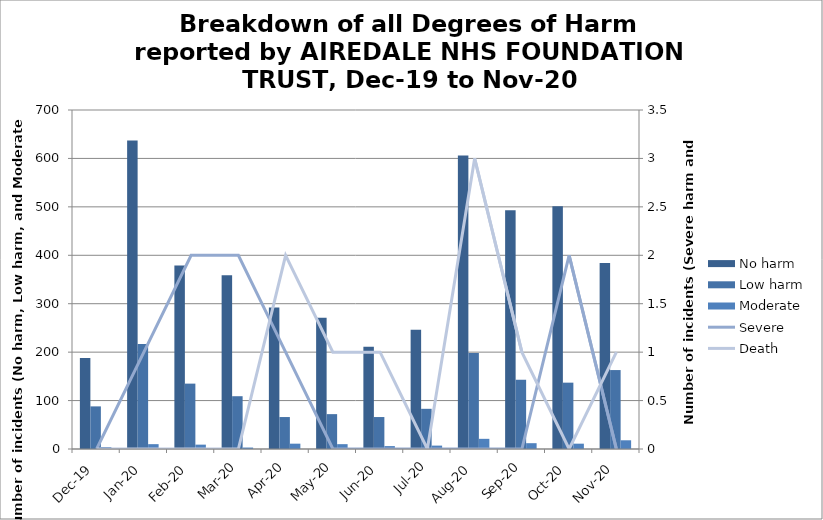
| Category | No harm | Low harm | Moderate |
|---|---|---|---|
| Dec-19 | 188 | 88 | 4 |
| Jan-20 | 637 | 217 | 10 |
| Feb-20 | 379 | 135 | 9 |
| Mar-20 | 359 | 109 | 3 |
| Apr-20 | 292 | 66 | 11 |
| May-20 | 271 | 72 | 10 |
| Jun-20 | 211 | 66 | 6 |
| Jul-20 | 246 | 83 | 7 |
| Aug-20 | 606 | 198 | 21 |
| Sep-20 | 493 | 143 | 12 |
| Oct-20 | 501 | 137 | 11 |
| Nov-20 | 384 | 163 | 18 |